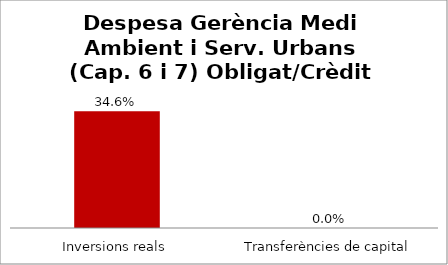
| Category | Series 0 |
|---|---|
| Inversions reals | 0.346 |
| Transferències de capital | 0 |